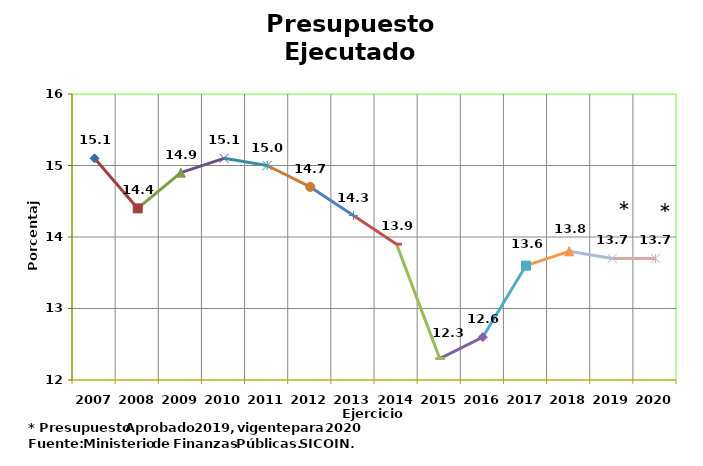
| Category | Series 0 |
|---|---|
| 2007 | 15.1 |
| 2008 | 14.4 |
| 2009 | 14.9 |
| 2010 | 15.1 |
| 2011 | 15 |
| 2012 | 14.7 |
| 2013 | 14.3 |
| 2014 | 13.9 |
| 2015 | 12.3 |
| 2016 | 12.6 |
| 2017 | 13.6 |
| 2018 | 13.8 |
| 2019 | 13.7 |
| 2020 | 13.7 |